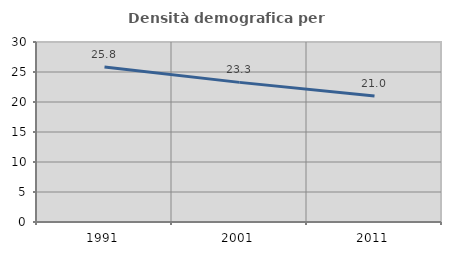
| Category | Densità demografica |
|---|---|
| 1991.0 | 25.849 |
| 2001.0 | 23.272 |
| 2011.0 | 20.998 |